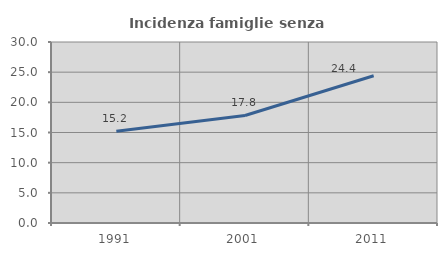
| Category | Incidenza famiglie senza nuclei |
|---|---|
| 1991.0 | 15.21 |
| 2001.0 | 17.82 |
| 2011.0 | 24.414 |